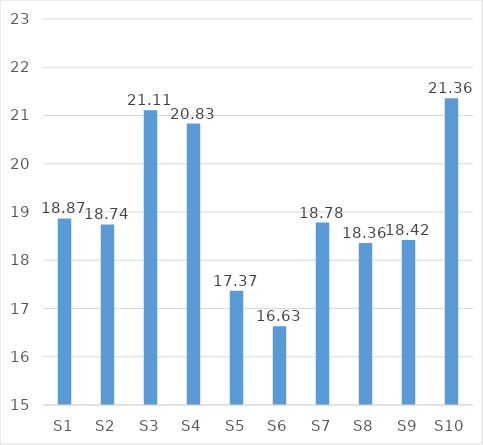
| Category | Mean |
|---|---|
| S1 | 18.868 |
| S2 | 18.741 |
| S3 | 21.111 |
| S4 | 20.833 |
| S5 | 17.367 |
| S6 | 16.631 |
| S7 | 18.781 |
| S8 | 18.356 |
| S9 | 18.418 |
| S10 | 21.36 |